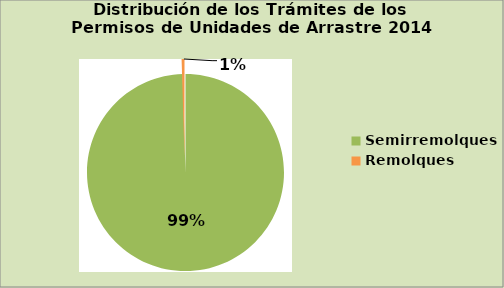
| Category | Series 0 |
|---|---|
| Semirremolques | 99.529 |
| Remolques | 0.471 |